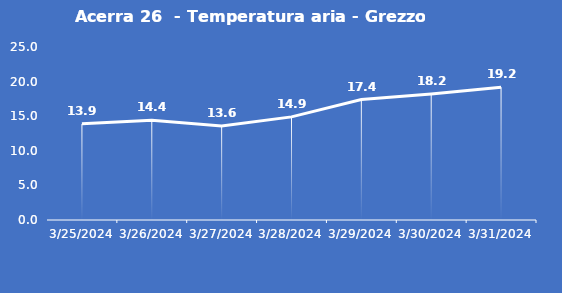
| Category | Acerra 26  - Temperatura aria - Grezzo (°C) |
|---|---|
| 3/25/24 | 13.9 |
| 3/26/24 | 14.4 |
| 3/27/24 | 13.6 |
| 3/28/24 | 14.9 |
| 3/29/24 | 17.4 |
| 3/30/24 | 18.2 |
| 3/31/24 | 19.2 |